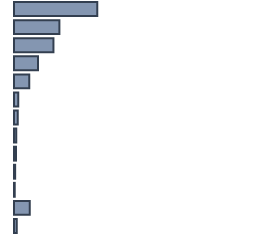
| Category | Percentatge |
|---|---|
| 0 | 34.696 |
| 1 | 18.913 |
| 2 | 16.435 |
| 3 | 10.043 |
| 4 | 6.348 |
| 5 | 1.783 |
| 6 | 1.522 |
| 7 | 0.957 |
| 8 | 0.826 |
| 9 | 0.478 |
| 10 | 0.304 |
| 11 | 6.565 |
| 12 | 1.13 |